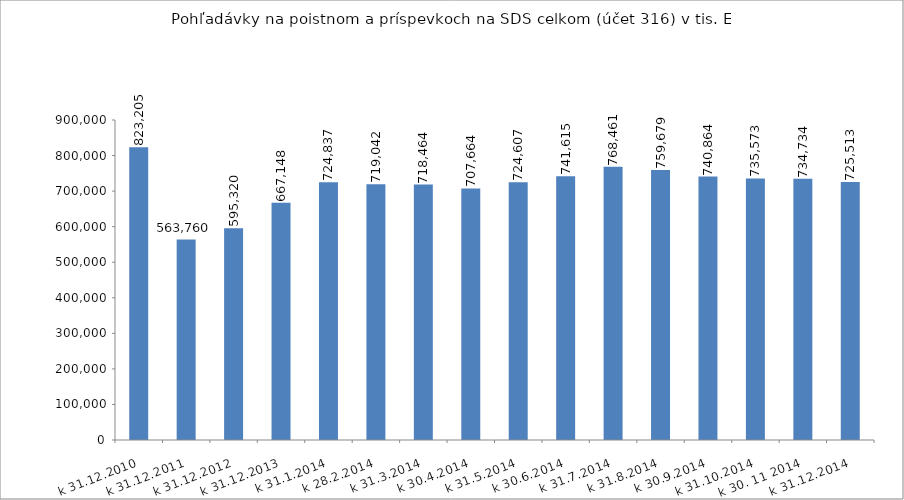
| Category | Series 0 |
|---|---|
| k 31.12.2010 | 823205 |
|  k 31.12.2011 | 563760.215 |
| k 31.12.2012 | 595319.52 |
| k 31.12.2013 | 667147.854 |
| k 31.1.2014 | 724836.546 |
| k 28.2.2014 | 719042.38 |
| k 31.3.2014 | 718464.014 |
| k 30.4.2014 | 707663.936 |
| k 31.5.2014 | 724606.913 |
| k 30.6.2014 | 741615.388 |
| k 31.7.2014 | 768461.077 |
| k 31.8.2014 | 759678.989 |
| k 30.9.2014 | 740864.103 |
| k 31.10.2014 | 735572.847 |
| k 30. 11 2014 | 734733.96 |
| k 31.12.2014 | 725513.4 |